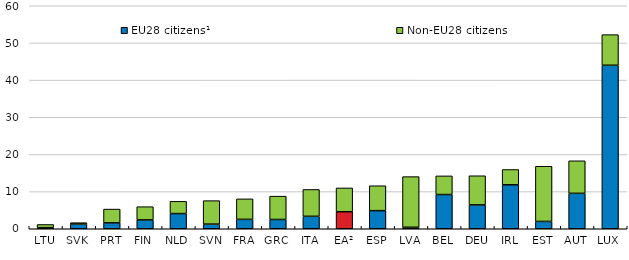
| Category | EU28 citizens¹ | Non-EU28 citizens |
|---|---|---|
| LTU | 0.288 | 0.86 |
| SVK | 1.282 | 0.353 |
| PRT | 1.597 | 3.699 |
| FIN | 2.383 | 3.556 |
| NLD | 4.083 | 3.298 |
| SVN | 1.245 | 6.32 |
| FRA | 2.529 | 5.513 |
| GRC | 2.497 | 6.275 |
| ITA | 3.35 | 7.22 |
| EA² | 4.578 | 6.406 |
| ESP | 4.869 | 6.708 |
| LVA | 0.402 | 13.624 |
| BEL | 9.211 | 5.014 |
| DEU | 6.422 | 7.841 |
| IRL | 11.826 | 4.118 |
| EST | 1.974 | 14.842 |
| AUT | 9.531 | 8.753 |
| LUX | 43.993 | 8.233 |